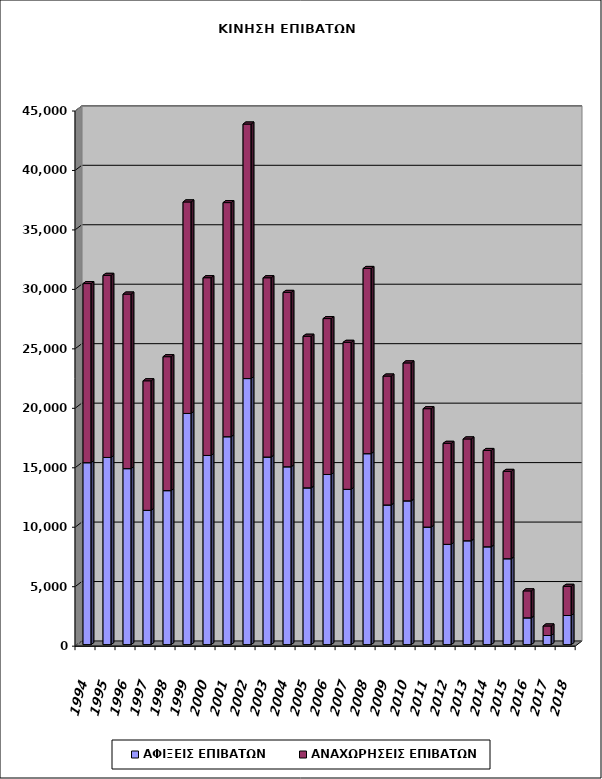
| Category | ΑΦΙΞΕΙΣ ΕΠΙΒΑΤΩΝ | ΑΝΑΧΩΡΗΣΕΙΣ ΕΠΙΒΑΤΩΝ |
|---|---|---|
| 1994.0 | 15300 | 15059 |
| 1995.0 | 15739 | 15311 |
| 1996.0 | 14799 | 14676 |
| 1997.0 | 11293 | 10891 |
| 1998.0 | 12949 | 11262 |
| 1999.0 | 19438 | 17784 |
| 2000.0 | 15907 | 14945 |
| 2001.0 | 17484 | 19683 |
| 2002.0 | 22372 | 21400 |
| 2003.0 | 15776 | 15072 |
| 2004.0 | 14956 | 14659 |
| 2005.0 | 13182 | 12747 |
| 2006.0 | 14307 | 13109 |
| 2007.0 | 13059 | 12358 |
| 2008.0 | 16058 | 15569 |
| 2009.0 | 11745 | 10837 |
| 2010.0 | 12090 | 11598 |
| 2011.0 | 9885 | 9954 |
| 2012.0 | 8433 | 8491 |
| 2013.0 | 8735 | 8559 |
| 2014.0 | 8228 | 8095 |
| 2015.0 | 7224 | 7341 |
| 2016.0 | 2253 | 2266 |
| 2017.0 | 768 | 800 |
| 2018.0 | 2449 | 2453 |